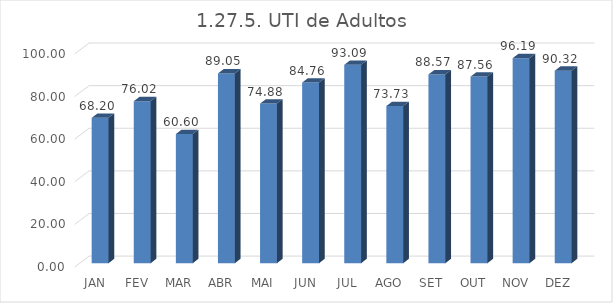
| Category | 1.27.5. UTI de Adultos  |
|---|---|
|  JAN  | 68.203 |
|  FEV  | 76.02 |
|  MAR  | 60.599 |
|  ABR  | 89.048 |
|  MAI  | 74.885 |
|  JUN  | 84.762 |
|  JUL  | 93.088 |
|  AGO  | 73.733 |
|  SET  | 88.571 |
|  OUT  | 87.558 |
|  NOV  | 96.19 |
|  DEZ  | 90.323 |